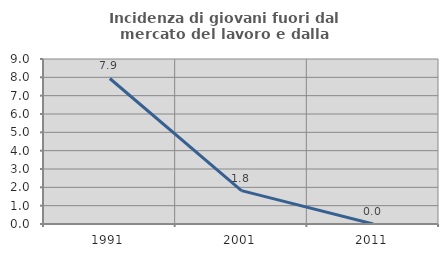
| Category | Incidenza di giovani fuori dal mercato del lavoro e dalla formazione  |
|---|---|
| 1991.0 | 7.937 |
| 2001.0 | 1.818 |
| 2011.0 | 0 |